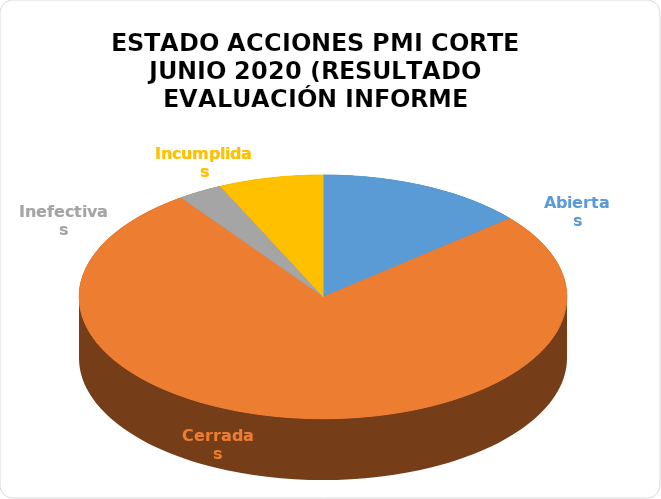
| Category | Series 0 |
|---|---|
| Abiertas | 14 |
| Cerradas | 77 |
| Inefectivas | 3 |
| Incumplidas | 7 |